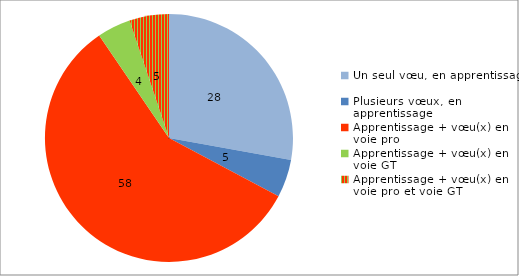
| Category | Series 0 |
|---|---|
| Un seul vœu, en apprentissage | 27.829 |
| Plusieurs vœux, en apprentissage | 4.939 |
| Apprentissage + vœu(x) en voie pro | 57.714 |
| Apprentissage + vœu(x) en voie GT | 4.363 |
| Apprentissage + vœu(x) en voie pro et voie GT | 5.155 |